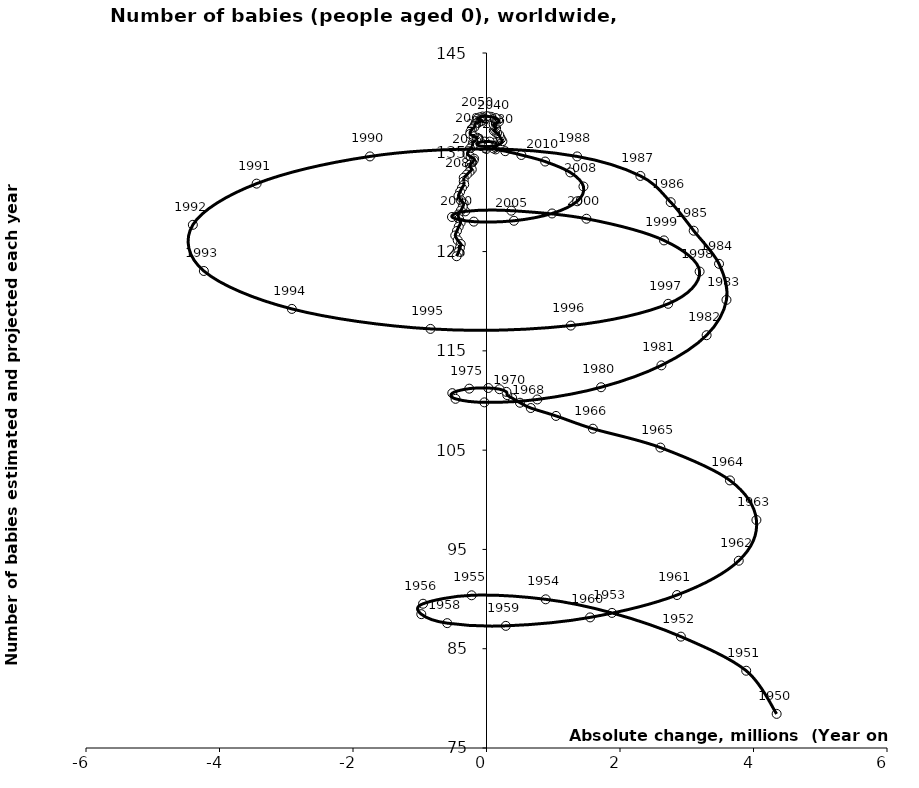
| Category | Series 0 |
|---|---|
| 4.346807999999996 | 78.436 |
| 3.8906939999999963 | 82.782 |
| 2.9123255000000015 | 86.217 |
| 1.879007499999993 | 88.607 |
| 0.8869564999999966 | 89.975 |
| -0.22300699999999551 | 90.381 |
| -0.9505549999999943 | 89.529 |
| -0.9768324999999933 | 88.48 |
| -0.5887355000000056 | 87.575 |
| 0.2897029999999958 | 87.302 |
| 1.552085999999953 | 88.155 |
| 2.853809499999997 | 90.406 |
| 3.7790275000000477 | 93.862 |
| 4.043732499999997 | 97.965 |
| 3.6472559999999987 | 101.95 |
| 2.6050070000000076 | 105.259 |
| 1.5937964999999963 | 107.16 |
| 1.0412924999999973 | 108.447 |
| 0.6634360000000044 | 109.242 |
| 0.501715499999996 | 109.774 |
| 0.3846490000000031 | 110.246 |
| 0.3113405000000071 | 110.543 |
| 0.2981334999999987 | 110.868 |
| 0.19482349999999826 | 111.139 |
| 0.027459499999991976 | 111.258 |
| -0.25880449999999655 | 111.194 |
| -0.512482999999996 | 110.74 |
| -0.46401150000000513 | 110.169 |
| -0.031621499999992864 | 109.812 |
| 0.7612065000000001 | 110.106 |
| 1.716144 | 111.335 |
| 2.620366500000003 | 113.538 |
| 3.297657000000001 | 116.576 |
| 3.595044999999992 | 120.133 |
| 3.4835369999999912 | 123.766 |
| 3.1038665000000023 | 127.1 |
| 2.7593794999999943 | 129.973 |
| 2.3053930000000094 | 132.619 |
| 1.3579355000000106 | 134.584 |
| -0.001093000000011557 | 135.335 |
| -1.7458950000000044 | 134.582 |
| -3.4439544999999967 | 131.843 |
| -4.399201499999997 | 127.694 |
| -4.234542499999996 | 123.045 |
| -2.916302999999999 | 119.225 |
| -0.8395215000000036 | 117.212 |
| 1.2631875000000008 | 117.546 |
| 2.7218035 | 119.739 |
| 3.1927294999999987 | 122.99 |
| 2.658998000000004 | 126.124 |
| 1.4975094999999996 | 128.308 |
| 0.3712579999999974 | 129.119 |
| -0.3187499999999943 | 129.05 |
| -0.517161999999999 | 128.482 |
| -0.19000650000000974 | 128.016 |
| 0.4108810000000034 | 128.102 |
| 0.9816600000000051 | 128.838 |
| 1.358508999999998 | 130.065 |
| 1.4525374999999912 | 131.555 |
| 1.2563585000000046 | 132.97 |
| 0.8786745000000167 | 134.067 |
| 0.5219179999999994 | 134.727 |
| 0.2807354999999916 | 135.111 |
| 0.13740199999999447 | 135.289 |
| 0.10486750000001166 | 135.386 |
| 0.13430999999999926 | 135.499 |
| 0.16403049999998132 | 135.655 |
| 0.16360199999999736 | 135.827 |
| 0.12373600000000806 | 135.982 |
| 0.04797450000000936 | 136.074 |
| -0.026354499999996506 | 136.078 |
| -0.09147950000000549 | 136.021 |
| -0.14002150000000313 | 135.895 |
| -0.13640149999999096 | 135.741 |
| -0.08083600000000501 | 135.622 |
| 0.033211499999993066 | 135.58 |
| 0.14954950000000622 | 135.688 |
| 0.21471449999999948 | 135.879 |
| 0.23794699999999125 | 136.118 |
| 0.2169254999999879 | 136.355 |
| 0.20139849999999626 | 136.552 |
| 0.189446000000018 | 136.757 |
| 0.15749700000000644 | 136.931 |
| 0.1301679999999834 | 137.072 |
| 0.1094824999999986 | 137.191 |
| 0.12709350000000086 | 137.291 |
| 0.1440719999999942 | 137.445 |
| 0.12671750000001225 | 137.58 |
| 0.11452000000001306 | 137.698 |
| 0.10758750000000816 | 137.809 |
| 0.14688599999999497 | 137.914 |
| 0.1878019999999907 | 138.102 |
| 0.17514400000000308 | 138.289 |
| 0.1371315000000095 | 138.453 |
| 0.07374950000000524 | 138.564 |
| 0.03626649999999643 | 138.6 |
| 0.0015829999999965594 | 138.636 |
| -0.06018100000000004 | 138.603 |
| -0.10464050000001635 | 138.516 |
| -0.1314375000000041 | 138.394 |
| -0.10089199999998755 | 138.253 |
| -0.0664225000000016 | 138.192 |
| -0.0846209999999985 | 138.12 |
| -0.11794799999999839 | 138.023 |
| -0.16596950000000277 | 137.884 |
| -0.1765244999999993 | 137.691 |
| -0.1819279999999992 | 137.531 |
| -0.2188380000000052 | 137.327 |
| -0.2395879999999977 | 137.093 |
| -0.24522699999999986 | 136.848 |
| -0.19271849999999802 | 136.603 |
| -0.13530000000000086 | 136.463 |
| -0.1345930000000095 | 136.332 |
| -0.15595100000000173 | 136.193 |
| -0.19988399999998308 | 136.02 |
| -0.20746049999999627 | 135.794 |
| -0.20933100000000593 | 135.605 |
| -0.2469380000000001 | 135.375 |
| -0.27240150000000085 | 135.112 |
| -0.285767000000007 | 134.83 |
| -0.23765050000000087 | 134.54 |
| -0.18550400000000877 | 134.355 |
| -0.19269149999999513 | 134.169 |
| -0.21424149999998576 | 133.97 |
| -0.24968200000000706 | 133.741 |
| -0.23780399999999702 | 133.47 |
| -0.2205409999999972 | 133.265 |
| -0.25436600000000453 | 133.029 |
| -0.294691499999999 | 132.756 |
| -0.34128850000000455 | 132.44 |
| -0.3407440000000008 | 132.074 |
| -0.3338824999999872 | 131.758 |
| -0.36786200000000235 | 131.406 |
| -0.39572350000000256 | 131.023 |
| -0.42014199999999846 | 130.614 |
| -0.38575350000000697 | 130.182 |
| -0.34256000000000597 | 129.843 |
| -0.3562440000000038 | 129.497 |
| -0.38439549999999656 | 129.13 |
| -0.42447149999999567 | 128.728 |
| -0.4097385000000031 | 128.282 |
| -0.38751849999999877 | 127.909 |
| -0.41607799999999884 | 127.506 |
| -0.4426235000000034 | 127.077 |
| -0.46826349999999906 | 126.621 |
| -0.43125599999999764 | 126.14 |
| -0.38606800000000163 | 125.759 |
| -0.39874499999999813 | 125.368 |
| -0.4187234999999987 | 124.961 |
| -0.44742649999999884 | 124.531 |